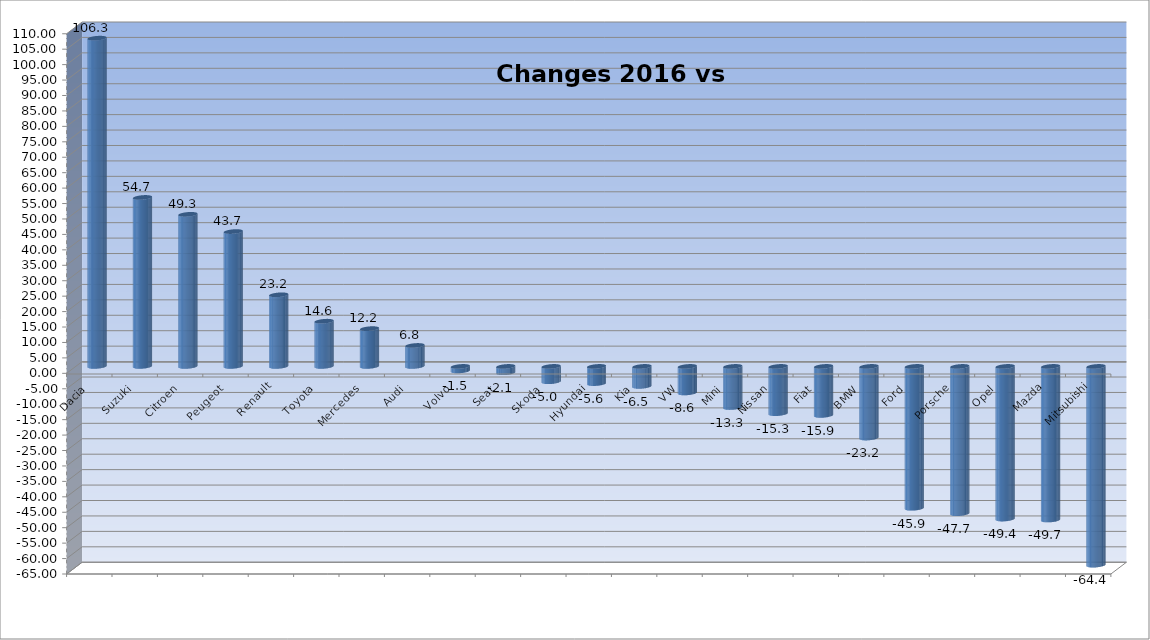
| Category | Ytd 2015 |
|---|---|
| Dacia | 106.329 |
| Suzuki | 54.737 |
| Citroen | 49.268 |
| Peugeot | 43.687 |
| Renault | 23.203 |
| Toyota | 14.645 |
| Mercedes | 12.244 |
| Audi | 6.793 |
| Volvo | -1.457 |
| Seat | -2.055 |
| Skoda | -4.961 |
| Hyundai | -5.564 |
| Kia | -6.467 |
| VW | -8.585 |
| Mini | -13.314 |
| Nissan | -15.296 |
| Fiat | -15.862 |
| BMW | -23.196 |
| Ford | -45.946 |
| Porsche | -47.687 |
| Opel | -49.441 |
| Mazda | -49.746 |
| Mitsubishi | -64.368 |